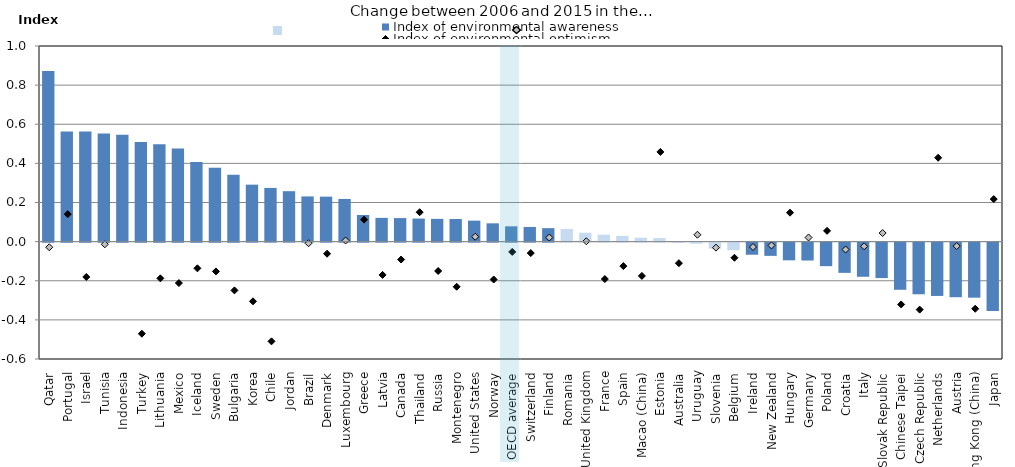
| Category | Index of environmental awareness |
|---|---|
| Qatar | 0.872 |
| Portugal | 0.563 |
| Israel | 0.563 |
| Tunisia | 0.553 |
| Indonesia | 0.546 |
| Turkey | 0.51 |
| Lithuania | 0.497 |
| Mexico | 0.476 |
| Iceland | 0.408 |
| Sweden | 0.378 |
| Bulgaria | 0.342 |
| Korea | 0.291 |
| Chile | 0.275 |
| Jordan | 0.258 |
| Brazil | 0.231 |
| Denmark | 0.23 |
| Luxembourg | 0.218 |
| Greece | 0.136 |
| Latvia | 0.121 |
| Canada | 0.12 |
| Thailand | 0.118 |
| Russia | 0.116 |
| Montenegro | 0.116 |
| United States | 0.107 |
| Norway | 0.093 |
| OECD average | 0.078 |
| Switzerland | 0.075 |
| Finland | 0.069 |
| Romania | 0.065 |
| United Kingdom | 0.045 |
| France | 0.035 |
| Spain | 0.029 |
| Macao (China) | 0.02 |
| Estonia | 0.018 |
| Australia | -0.002 |
| Uruguay | -0.006 |
| Slovenia | -0.031 |
| Belgium | -0.039 |
| Ireland | -0.062 |
| New Zealand | -0.068 |
| Hungary | -0.09 |
| Germany | -0.091 |
| Poland | -0.12 |
| Croatia | -0.154 |
| Italy | -0.175 |
| Slovak Republic | -0.181 |
| Chinese Taipei | -0.241 |
| Czech Republic | -0.264 |
| Netherlands | -0.273 |
| Austria | -0.279 |
| Hong Kong (China) | -0.281 |
| Japan | -0.35 |